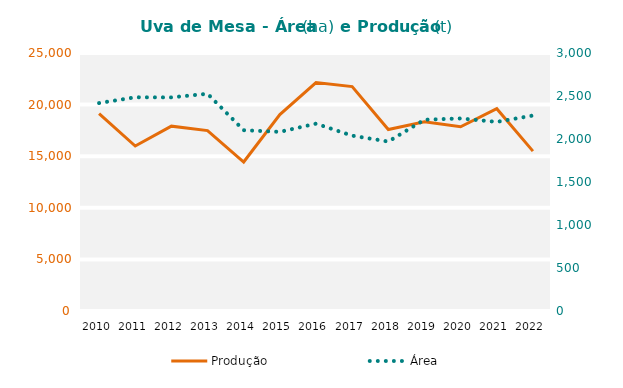
| Category | Produção  |
|---|---|
| 2010 | 19124 |
| 2011 | 15989 |
| 2012 | 17913 |
| 2013 | 17479 |
| 2014 | 14435 |
| 2015 | 19033 |
| 2016 | 22136 |
| 2017 | 21744 |
| 2018 | 17586 |
| 2019 | 18335 |
| 2020 | 17849 |
| 2021 | 19601 |
| 2022 | 15491 |